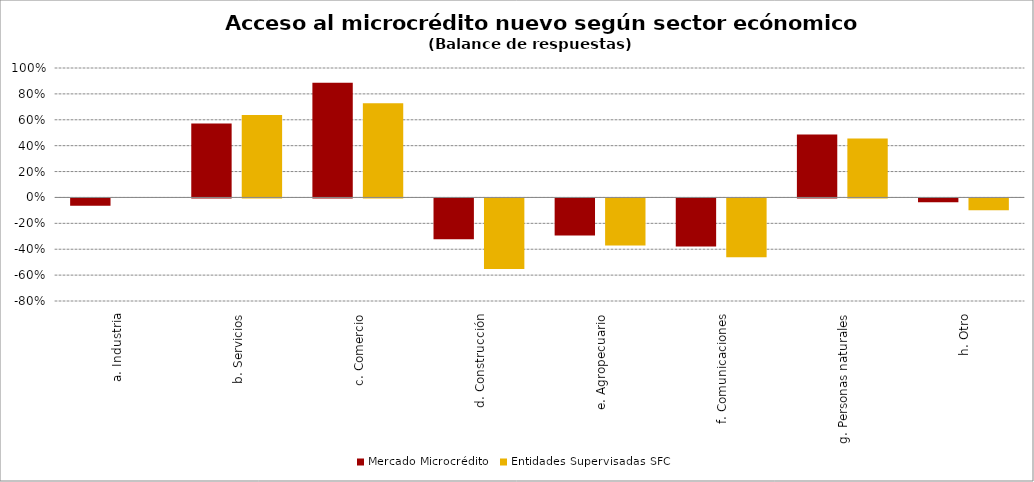
| Category | Mercado Microcrédito | Entidades Supervisadas SFC |
|---|---|---|
| a. Industria | -0.057 | 0 |
| b. Servicios | 0.571 | 0.636 |
| c. Comercio | 0.886 | 0.727 |
| d. Construcción | -0.314 | -0.545 |
| e. Agropecuario | -0.286 | -0.364 |
| f. Comunicaciones | -0.371 | -0.455 |
| g. Personas naturales | 0.486 | 0.455 |
| h. Otro | -0.029 | -0.091 |